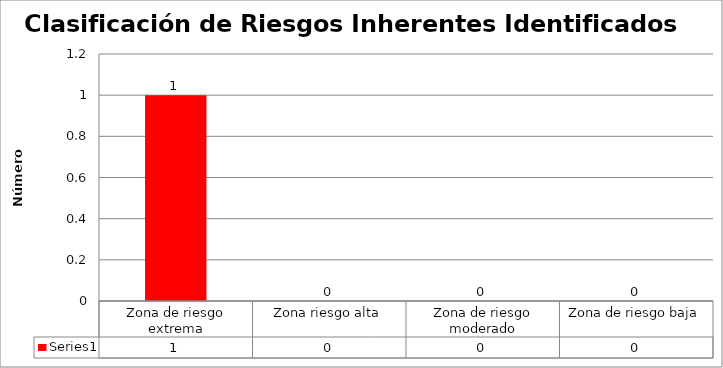
| Category | Series 0 |
|---|---|
| Zona de riesgo extrema | 1 |
| Zona riesgo alta | 0 |
| Zona de riesgo moderado | 0 |
| Zona de riesgo baja | 0 |